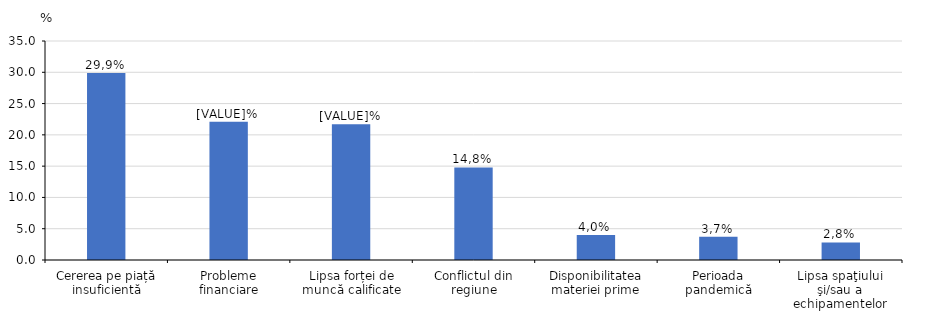
| Category | Series 0 |
|---|---|
| Cererea pe piață insuficientă | 29.9 |
| Probleme financiare | 22.1 |
| Lipsa forței de muncă calificate | 21.7 |
| Conflictul din regiune | 14.8 |
| Disponibilitatea materiei prime | 4 |
| Perioada pandemică | 3.7 |
| Lipsa spaţiului şi/sau a echipamentelor | 2.8 |